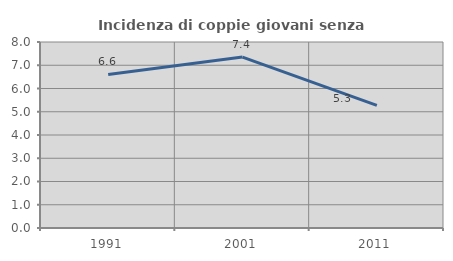
| Category | Incidenza di coppie giovani senza figli |
|---|---|
| 1991.0 | 6.604 |
| 2001.0 | 7.351 |
| 2011.0 | 5.274 |